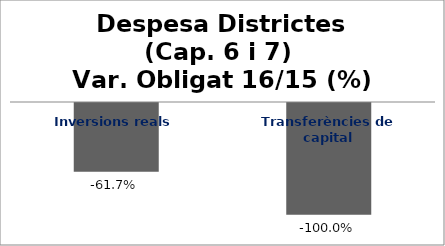
| Category | Series 0 |
|---|---|
| Inversions reals | -0.617 |
| Transferències de capital | -1 |